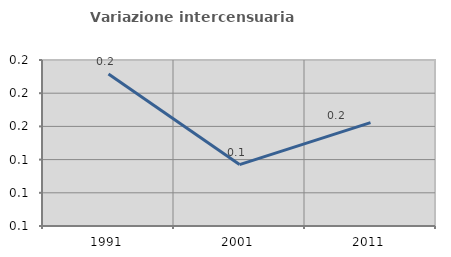
| Category | Variazione intercensuaria annua |
|---|---|
| 1991.0 | 0.166 |
| 2001.0 | 0.139 |
| 2011.0 | 0.151 |